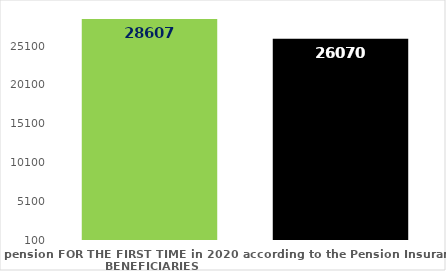
| Category | broj korisnika |
|---|---|
| Pension beneficiaries entitled to pension FOR THE FIRST TIME in 2020 according to the Pension Insurance Act  - NEW BENEFICIARIES | 28607 |
| Pension beneficiaries whose pension entitlement ceased in 2020  -  death caused,   
and who were retired according to the Pension Insurance Act   | 26070 |